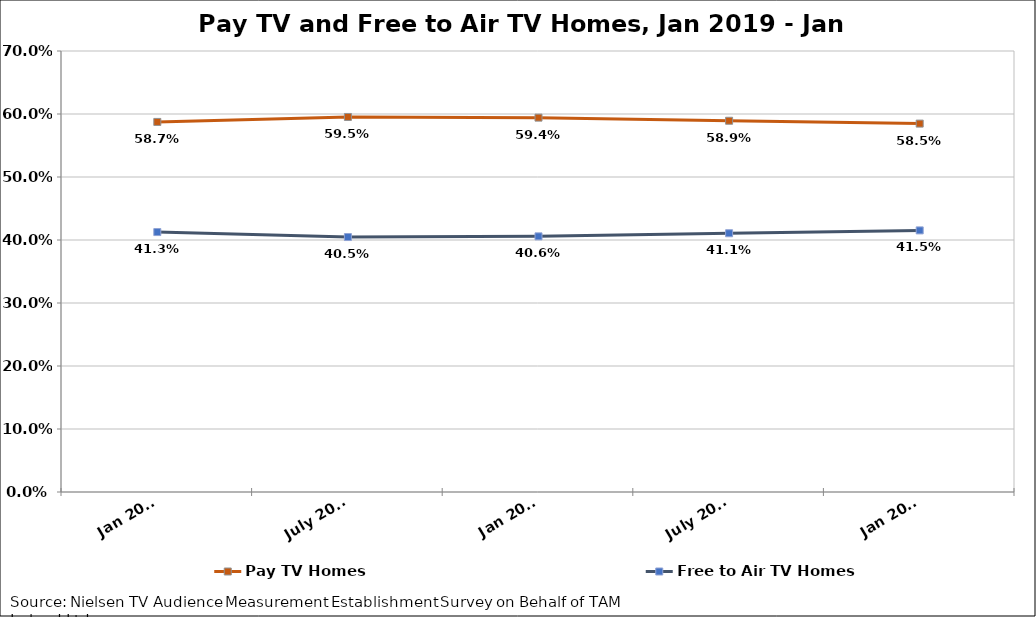
| Category | Pay TV Homes | Free to Air TV Homes |
|---|---|---|
| Jan 2019 | 0.587 | 0.413 |
| July 2019 | 0.595 | 0.405 |
| Jan 2020 | 0.594 | 0.406 |
| July 2020 | 0.589 | 0.411 |
| Jan 2021 | 0.585 | 0.415 |